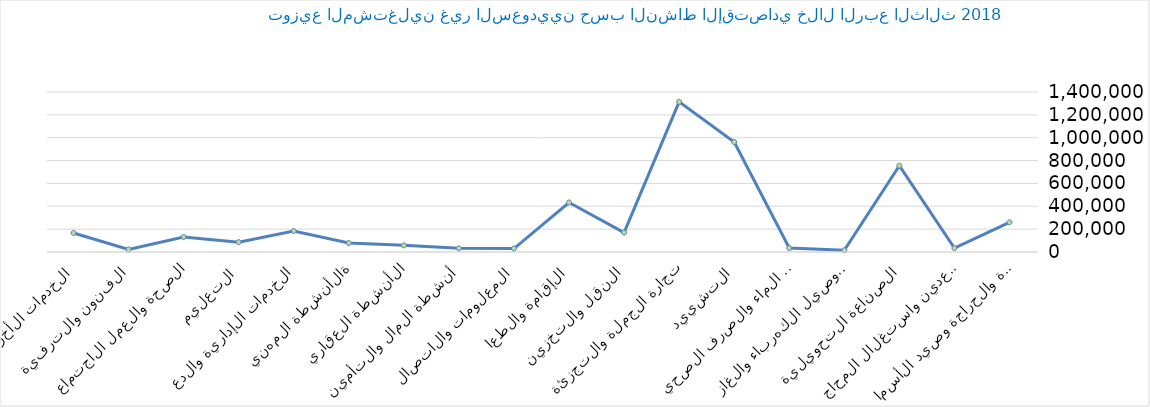
| Category | Series 0 |
|---|---|
| الزراعة والحراجة وصيد الأسماك | 259652 |
| التعدين واستغلال المحاجر | 33730 |
| الصناعة التحويلية | 755430 |
| توصيل الكهرباء والغاز  | 15631 |
| امدادات الماء والصرف الصحي | 34522 |
| التشييد | 962250 |
| تجارة الجملة والتجزئة | 1314152 |
| النقل والتخزين | 170309 |
| الإقامة والطعام | 433311 |
| المعلومات والاتصالات | 30334 |
| أنشطة المال والتأمين | 32145 |
| الأنشطة العقارية | 58281 |
| الأنشطة المهنية  | 78438 |
| الخدمات الإدارية والدعم | 183947 |
| التعليم | 86114 |
| الصحة والعمل الاجتماعي | 131877 |
| الفنون والترفية | 23006 |
| الخدمات الأخرى | 166601 |